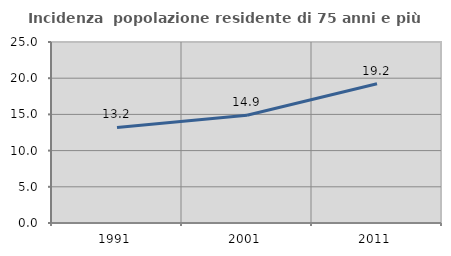
| Category | Incidenza  popolazione residente di 75 anni e più |
|---|---|
| 1991.0 | 13.193 |
| 2001.0 | 14.877 |
| 2011.0 | 19.225 |